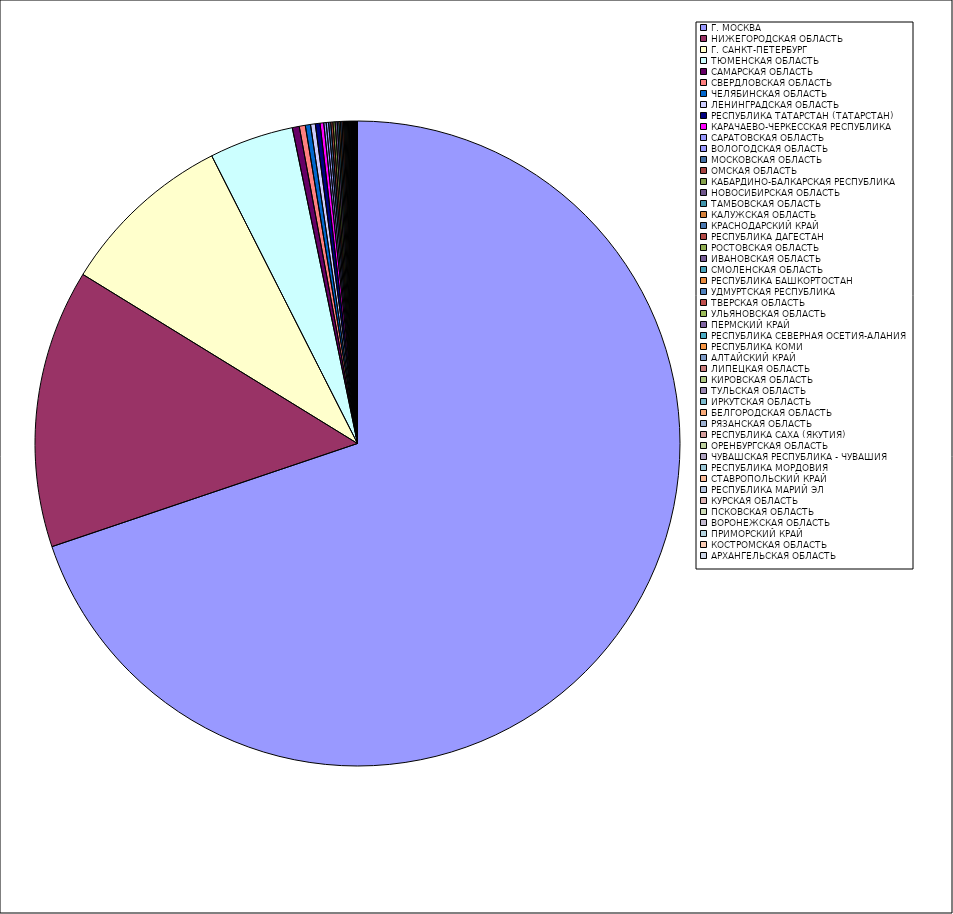
| Category | Оборот |
|---|---|
| Г. МОСКВА | 69.795 |
| НИЖЕГОРОДСКАЯ ОБЛАСТЬ | 13.961 |
| Г. САНКТ-ПЕТЕРБУРГ | 8.748 |
| ТЮМЕНСКАЯ ОБЛАСТЬ | 4.222 |
| САМАРСКАЯ ОБЛАСТЬ | 0.35 |
| СВЕРДЛОВСКАЯ ОБЛАСТЬ | 0.302 |
| ЧЕЛЯБИНСКАЯ ОБЛАСТЬ | 0.262 |
| ЛЕНИНГРАДСКАЯ ОБЛАСТЬ | 0.237 |
| РЕСПУБЛИКА ТАТАРСТАН (ТАТАРСТАН) | 0.235 |
| КАРАЧАЕВО-ЧЕРКЕССКАЯ РЕСПУБЛИКА | 0.185 |
| САРАТОВСКАЯ ОБЛАСТЬ | 0.121 |
| ВОЛОГОДСКАЯ ОБЛАСТЬ | 0.117 |
| МОСКОВСКАЯ ОБЛАСТЬ | 0.109 |
| ОМСКАЯ ОБЛАСТЬ | 0.108 |
| КАБАРДИНО-БАЛКАРСКАЯ РЕСПУБЛИКА | 0.107 |
| НОВОСИБИРСКАЯ ОБЛАСТЬ | 0.106 |
| ТАМБОВСКАЯ ОБЛАСТЬ | 0.084 |
| КАЛУЖСКАЯ ОБЛАСТЬ | 0.076 |
| КРАСНОДАРСКИЙ КРАЙ | 0.075 |
| РЕСПУБЛИКА ДАГЕСТАН | 0.072 |
| РОСТОВСКАЯ ОБЛАСТЬ | 0.052 |
| ИВАНОВСКАЯ ОБЛАСТЬ | 0.052 |
| СМОЛЕНСКАЯ ОБЛАСТЬ | 0.05 |
| РЕСПУБЛИКА БАШКОРТОСТАН | 0.047 |
| УДМУРТСКАЯ РЕСПУБЛИКА | 0.043 |
| ТВЕРСКАЯ ОБЛАСТЬ | 0.042 |
| УЛЬЯНОВСКАЯ ОБЛАСТЬ | 0.038 |
| ПЕРМСКИЙ КРАЙ | 0.035 |
| РЕСПУБЛИКА СЕВЕРНАЯ ОСЕТИЯ-АЛАНИЯ | 0.031 |
| РЕСПУБЛИКА КОМИ | 0.031 |
| АЛТАЙСКИЙ КРАЙ | 0.027 |
| ЛИПЕЦКАЯ ОБЛАСТЬ | 0.024 |
| КИРОВСКАЯ ОБЛАСТЬ | 0.023 |
| ТУЛЬСКАЯ ОБЛАСТЬ | 0.021 |
| ИРКУТСКАЯ ОБЛАСТЬ | 0.02 |
| БЕЛГОРОДСКАЯ ОБЛАСТЬ | 0.02 |
| РЯЗАНСКАЯ ОБЛАСТЬ | 0.02 |
| РЕСПУБЛИКА САХА (ЯКУТИЯ) | 0.018 |
| ОРЕНБУРГСКАЯ ОБЛАСТЬ | 0.016 |
| ЧУВАШСКАЯ РЕСПУБЛИКА - ЧУВАШИЯ | 0.013 |
| РЕСПУБЛИКА МОРДОВИЯ | 0.012 |
| СТАВРОПОЛЬСКИЙ КРАЙ | 0.011 |
| РЕСПУБЛИКА МАРИЙ ЭЛ | 0.01 |
| КУРСКАЯ ОБЛАСТЬ | 0.009 |
| ПСКОВСКАЯ ОБЛАСТЬ | 0.009 |
| ВОРОНЕЖСКАЯ ОБЛАСТЬ | 0.007 |
| ПРИМОРСКИЙ КРАЙ | 0.006 |
| КОСТРОМСКАЯ ОБЛАСТЬ | 0.006 |
| АРХАНГЕЛЬСКАЯ ОБЛАСТЬ | 0.005 |